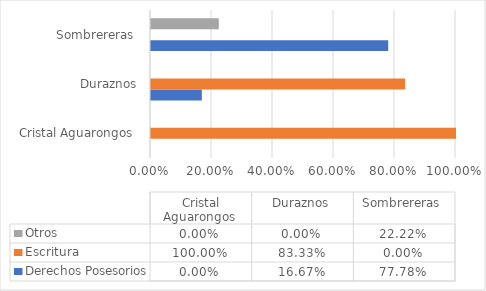
| Category | Derechos Posesorios | Escritura  | Otros |
|---|---|---|---|
| Cristal Aguarongos  | 0 | 1 | 0 |
| Duraznos | 0.167 | 0.833 | 0 |
| Sombrereras  | 0.778 | 0 | 0.222 |